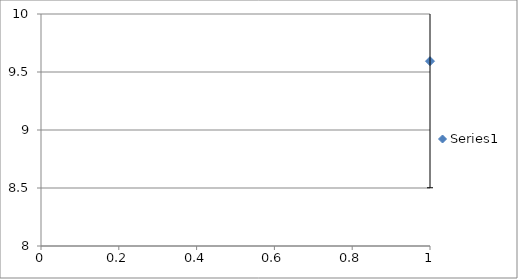
| Category | Series 0 |
|---|---|
| 0 | 9.593 |
| 1 | 9.61 |
| 2 | 9.758 |
| 3 | 9.64 |
| 4 | 9.6 |
| 5 | 9.58 |
| 6 | 9.534 |
| 7 | 9.499 |
| 8 | 9.629 |